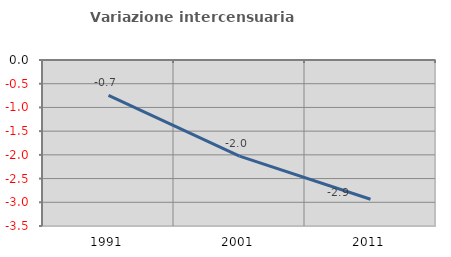
| Category | Variazione intercensuaria annua |
|---|---|
| 1991.0 | -0.745 |
| 2001.0 | -2.028 |
| 2011.0 | -2.936 |